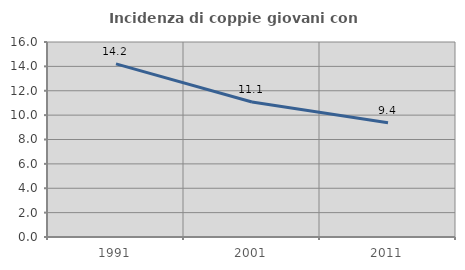
| Category | Incidenza di coppie giovani con figli |
|---|---|
| 1991.0 | 14.209 |
| 2001.0 | 11.079 |
| 2011.0 | 9.38 |